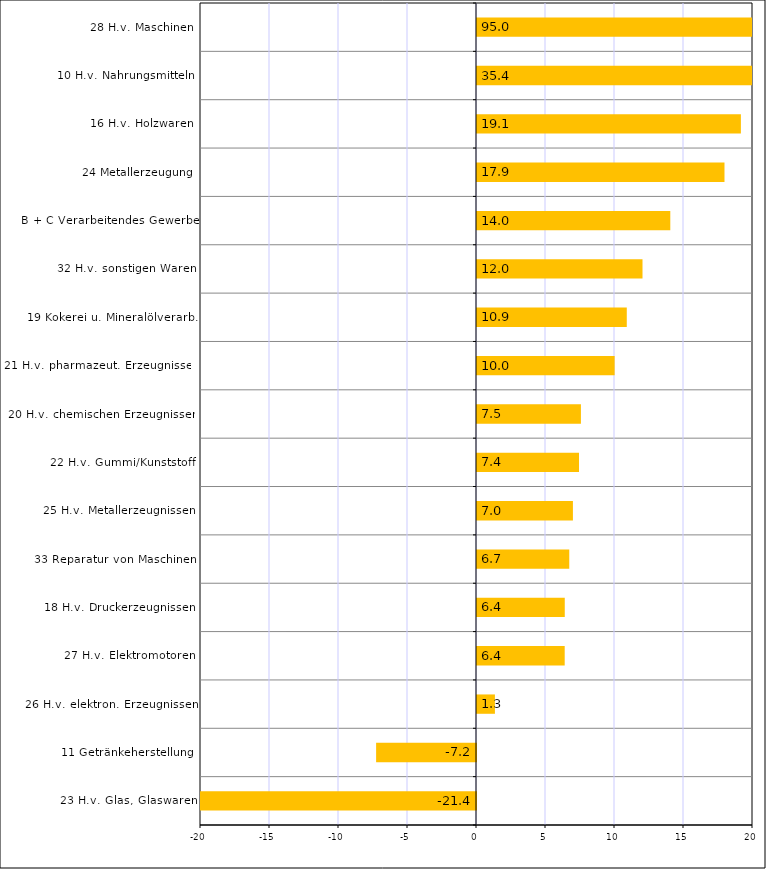
| Category | Series 2 |
|---|---|
| 23 H.v. Glas, Glaswaren | -21.367 |
| 11 Getränkeherstellung | -7.238 |
| 26 H.v. elektron. Erzeugnissen | 1.298 |
| 27 H.v. Elektromotoren | 6.355 |
| 18 H.v. Druckerzeugnissen | 6.36 |
| 33 Reparatur von Maschinen | 6.686 |
| 25 H.v. Metallerzeugnissen | 6.951 |
| 22 H.v. Gummi/Kunststoff | 7.392 |
| 20 H.v. chemischen Erzeugnissen | 7.53 |
| 21 H.v. pharmazeut. Erzeugnissen | 9.974 |
| 19 Kokerei u. Mineralölverarb. | 10.854 |
| 32 H.v. sonstigen Waren | 11.993 |
| B + C Verarbeitendes Gewerbe | 14.007 |
| 24 Metallerzeugung | 17.934 |
| 16 H.v. Holzwaren | 19.122 |
| 10 H.v. Nahrungsmitteln | 35.389 |
| 28 H.v. Maschinen | 95.045 |